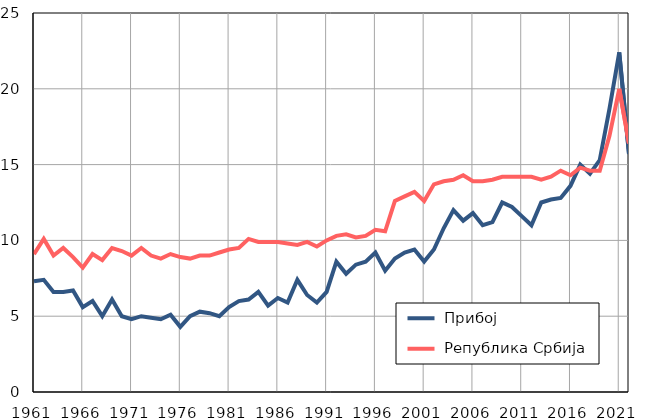
| Category |  Прибој |  Република Србија |
|---|---|---|
| 1961.0 | 7.3 | 9.1 |
| 1962.0 | 7.4 | 10.1 |
| 1963.0 | 6.6 | 9 |
| 1964.0 | 6.6 | 9.5 |
| 1965.0 | 6.7 | 8.9 |
| 1966.0 | 5.6 | 8.2 |
| 1967.0 | 6 | 9.1 |
| 1968.0 | 5 | 8.7 |
| 1969.0 | 6.1 | 9.5 |
| 1970.0 | 5 | 9.3 |
| 1971.0 | 4.8 | 9 |
| 1972.0 | 5 | 9.5 |
| 1973.0 | 4.9 | 9 |
| 1974.0 | 4.8 | 8.8 |
| 1975.0 | 5.1 | 9.1 |
| 1976.0 | 4.3 | 8.9 |
| 1977.0 | 5 | 8.8 |
| 1978.0 | 5.3 | 9 |
| 1979.0 | 5.2 | 9 |
| 1980.0 | 5 | 9.2 |
| 1981.0 | 5.6 | 9.4 |
| 1982.0 | 6 | 9.5 |
| 1983.0 | 6.1 | 10.1 |
| 1984.0 | 6.6 | 9.9 |
| 1985.0 | 5.7 | 9.9 |
| 1986.0 | 6.2 | 9.9 |
| 1987.0 | 5.9 | 9.8 |
| 1988.0 | 7.4 | 9.7 |
| 1989.0 | 6.4 | 9.9 |
| 1990.0 | 5.9 | 9.6 |
| 1991.0 | 6.6 | 10 |
| 1992.0 | 8.6 | 10.3 |
| 1993.0 | 7.8 | 10.4 |
| 1994.0 | 8.4 | 10.2 |
| 1995.0 | 8.6 | 10.3 |
| 1996.0 | 9.2 | 10.7 |
| 1997.0 | 8 | 10.6 |
| 1998.0 | 8.8 | 12.6 |
| 1999.0 | 9.2 | 12.9 |
| 2000.0 | 9.4 | 13.2 |
| 2001.0 | 8.6 | 12.6 |
| 2002.0 | 9.4 | 13.7 |
| 2003.0 | 10.8 | 13.9 |
| 2004.0 | 12 | 14 |
| 2005.0 | 11.3 | 14.3 |
| 2006.0 | 11.8 | 13.9 |
| 2007.0 | 11 | 13.9 |
| 2008.0 | 11.2 | 14 |
| 2009.0 | 12.5 | 14.2 |
| 2010.0 | 12.2 | 14.2 |
| 2011.0 | 11.6 | 14.2 |
| 2012.0 | 11 | 14.2 |
| 2013.0 | 12.5 | 14 |
| 2014.0 | 12.7 | 14.2 |
| 2015.0 | 12.8 | 14.6 |
| 2016.0 | 13.6 | 14.3 |
| 2017.0 | 15 | 14.8 |
| 2018.0 | 14.4 | 14.6 |
| 2019.0 | 15.3 | 14.6 |
| 2020.0 | 18.7 | 16.9 |
| 2021.0 | 22.4 | 20 |
| 2022.0 | 15.7 | 16.4 |